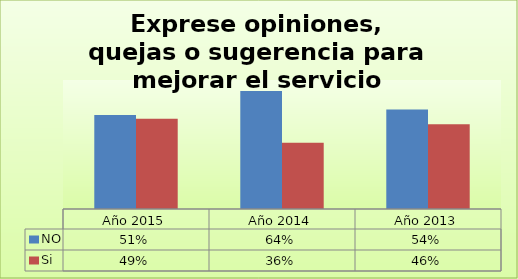
| Category | NO | Si  |
|---|---|---|
| Año 2015 | 0.51 | 0.49 |
| Año 2014 | 0.64 | 0.36 |
| Año 2013 | 0.54 | 0.46 |